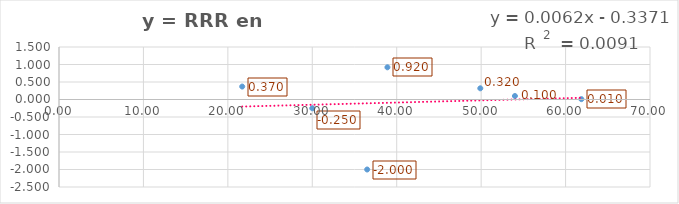
| Category | y = RRR en MortCV |
|---|---|
| 38.9 | 0.92 |
| 54.0 | 0.1 |
| 61.8716163959784 | 0.01 |
| 21.7 | 0.37 |
| 36.5 | -2 |
| 30.0 | -0.25 |
| 49.9 | 0.32 |